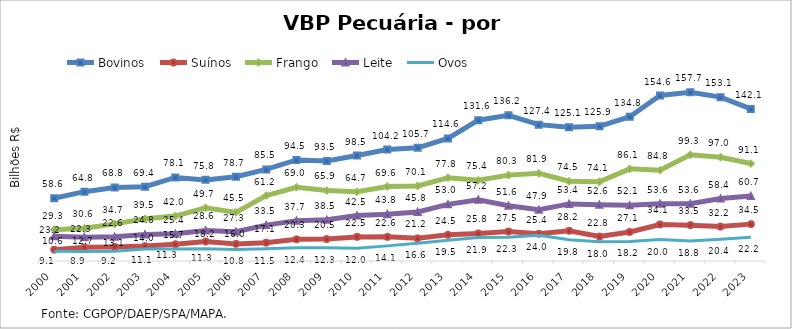
| Category | Bovinos | Suínos | Frango | Leite | Ovos |
|---|---|---|---|---|---|
| 2000 | 58.628 | 10.616 | 29.285 | 23.158 | 9.054 |
| 2001 | 64.808 | 12.736 | 30.563 | 22.284 | 8.922 |
| 2002 | 68.774 | 13.053 | 34.706 | 22.564 | 9.193 |
| 2003 | 69.411 | 13.95 | 39.51 | 24.848 | 11.12 |
| 2004 | 78.095 | 15.685 | 41.98 | 25.396 | 11.27 |
| 2005 | 75.819 | 18.185 | 49.687 | 28.564 | 11.346 |
| 2006 | 78.719 | 15.996 | 45.457 | 27.283 | 10.778 |
| 2007 | 85.549 | 17.105 | 61.202 | 33.54 | 11.455 |
| 2008 | 94.456 | 20.254 | 68.956 | 37.731 | 12.371 |
| 2009 | 93.471 | 20.474 | 65.915 | 38.467 | 12.335 |
| 2010 | 98.547 | 22.523 | 64.729 | 42.482 | 11.997 |
| 2011 | 104.179 | 22.558 | 69.625 | 43.794 | 14.136 |
| 2012 | 105.732 | 21.181 | 70.115 | 45.763 | 16.571 |
| 2013 | 114.576 | 24.525 | 77.788 | 52.956 | 19.49 |
| 2014 | 131.627 | 25.759 | 75.399 | 57.186 | 21.898 |
| 2015 | 136.157 | 27.528 | 80.259 | 51.62 | 22.296 |
| 2016 | 127.45 | 25.404 | 81.914 | 47.897 | 24.037 |
| 2017 | 125.07 | 28.201 | 74.506 | 53.368 | 19.813 |
| 2018 | 125.908 | 22.839 | 74.072 | 52.574 | 18.016 |
| 2019 | 134.82 | 27.147 | 86.105 | 52.087 | 18.246 |
| 2020 | 154.647 | 34.123 | 84.813 | 53.553 | 20.038 |
| 2021 | 157.699 | 33.516 | 99.32 | 53.612 | 18.778 |
| 2022 | 153.131 | 32.154 | 97.015 | 58.376 | 20.377 |
| 2023 | 142.138 | 34.46 | 91.057 | 60.711 | 22.209 |